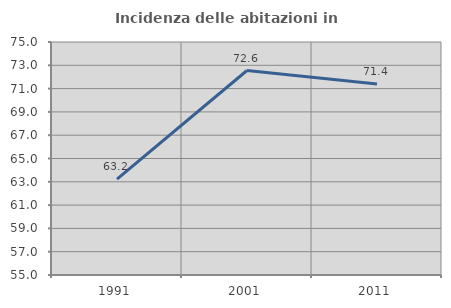
| Category | Incidenza delle abitazioni in proprietà  |
|---|---|
| 1991.0 | 63.237 |
| 2001.0 | 72.552 |
| 2011.0 | 71.401 |